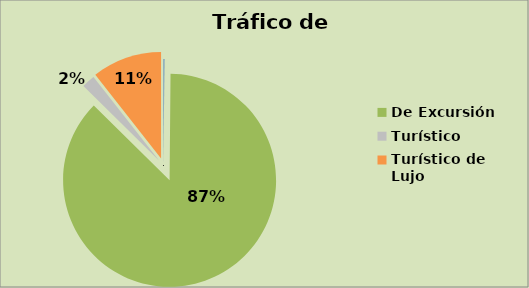
| Category | Series 0 |
|---|---|
| Chofer Guía | 0.138 |
| De Excursión | 87.254 |
| Turístico  | 2.015 |
| Turístico de Lujo  | 10.592 |